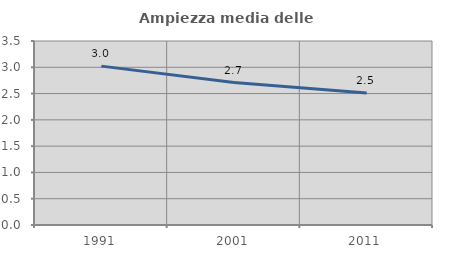
| Category | Ampiezza media delle famiglie |
|---|---|
| 1991.0 | 3.022 |
| 2001.0 | 2.71 |
| 2011.0 | 2.513 |